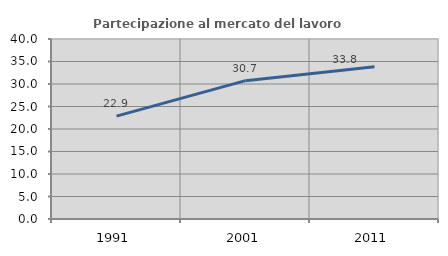
| Category | Partecipazione al mercato del lavoro  femminile |
|---|---|
| 1991.0 | 22.857 |
| 2001.0 | 30.742 |
| 2011.0 | 33.84 |